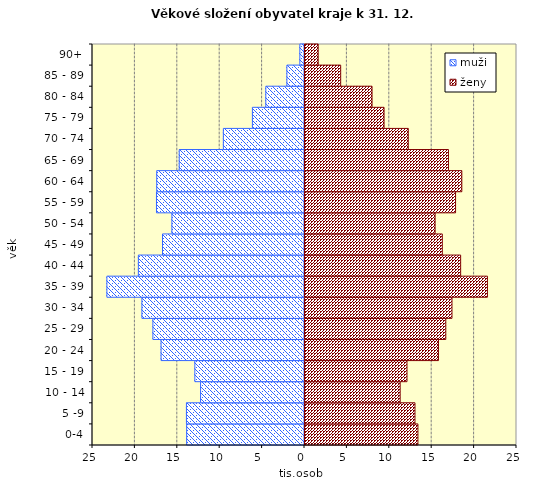
| Category | muži | ženy |
|---|---|---|
| 0-4 | -13896 | 13435 |
|  5 -9 | -13924 | 13087 |
|  10 - 14 | -12254 | 11340 |
| 15 - 19 | -12931 | 12146 |
| 20 - 24 | -16914 | 15859 |
| 25 - 29 | -17878 | 16720 |
| 30 - 34 | -19173 | 17450 |
| 35 - 39 | -23302 | 21631 |
| 40 - 44 | -19592 | 18473 |
| 45 - 49 | -16745 | 16309 |
| 50 - 54 | -15637 | 15460 |
| 55 - 59 | -17455 | 17873 |
| 60 - 64 | -17427 | 18611 |
| 65 - 69 | -14771 | 17035 |
| 70 - 74 | -9569 | 12297 |
| 75 - 79 | -6143 | 9441 |
| 80 - 84 | -4561 | 8024 |
| 85 - 89 | -2075 | 4325 |
| 90+ | -550 | 1672 |